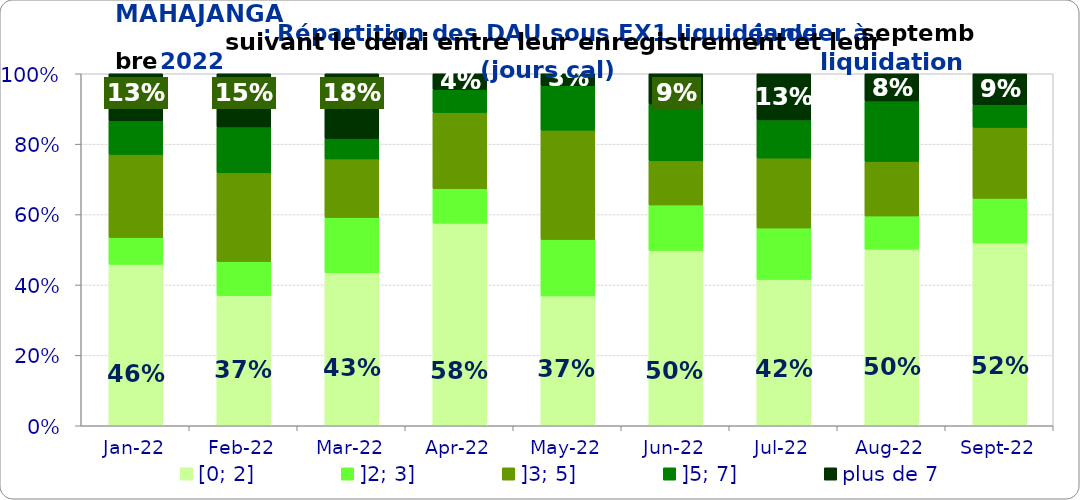
| Category | [0; 2] | ]2; 3] | ]3; 5] | ]5; 7] | plus de 7 |
|---|---|---|---|---|---|
| 2022-01-01 | 0.459 | 0.076 | 0.236 | 0.096 | 0.134 |
| 2022-02-01 | 0.37 | 0.097 | 0.252 | 0.13 | 0.151 |
| 2022-03-01 | 0.435 | 0.157 | 0.166 | 0.058 | 0.184 |
| 2022-04-01 | 0.576 | 0.098 | 0.216 | 0.065 | 0.045 |
| 2022-05-01 | 0.369 | 0.16 | 0.311 | 0.126 | 0.034 |
| 2022-06-01 | 0.498 | 0.129 | 0.125 | 0.161 | 0.086 |
| 2022-07-01 | 0.416 | 0.146 | 0.199 | 0.109 | 0.131 |
| 2022-08-01 | 0.502 | 0.094 | 0.155 | 0.172 | 0.077 |
| 2022-09-01 | 0.519 | 0.127 | 0.201 | 0.065 | 0.088 |